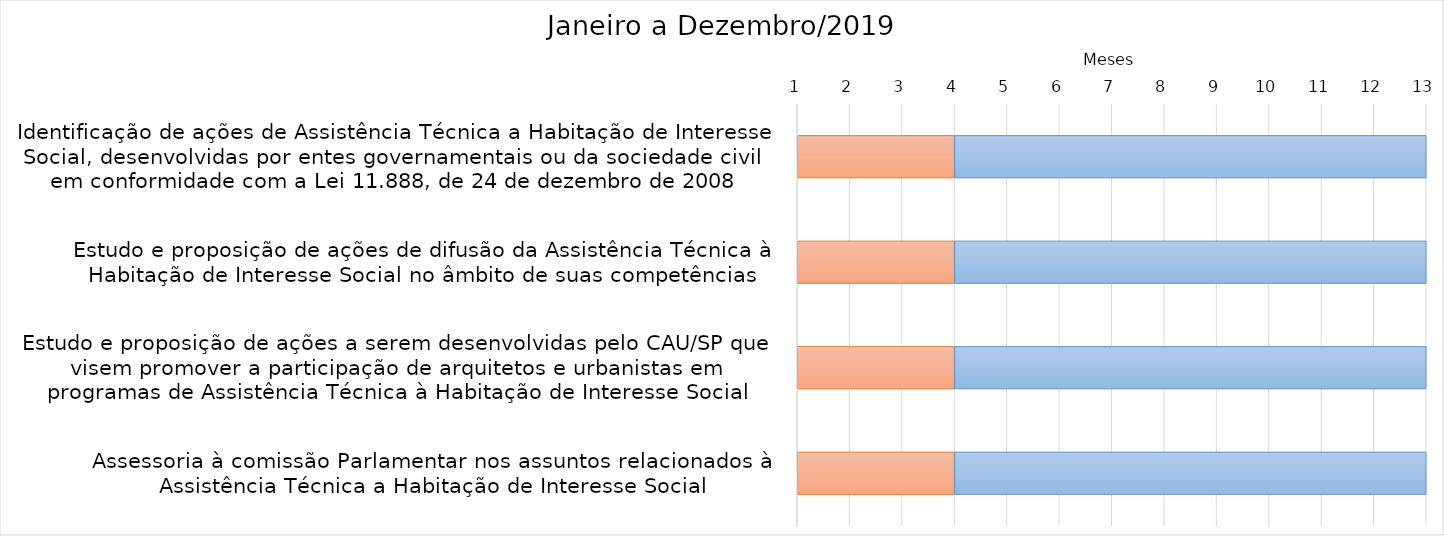
| Category | Início | Duração |
|---|---|---|
| Identificação de ações de Assistência Técnica a Habitação de Interesse Social, desenvolvidas por entes governamentais ou da sociedade civil em conformidade com a Lei 11.888, de 24 de dezembro de 2008 | 4 | 9 |
| Estudo e proposição de ações de difusão da Assistência Técnica à Habitação de Interesse Social no âmbito de suas competências | 4 | 9 |
| Estudo e proposição de ações a serem desenvolvidas pelo CAU/SP que visem promover a participação de arquitetos e urbanistas em programas de Assistência Técnica à Habitação de Interesse Social | 4 | 9 |
| Assessoria à comissão Parlamentar nos assuntos relacionados à Assistência Técnica a Habitação de Interesse Social | 4 | 9 |